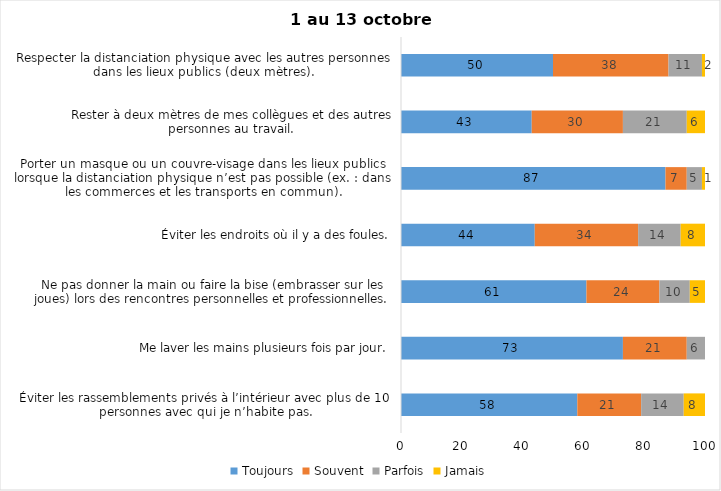
| Category | Toujours | Souvent | Parfois | Jamais |
|---|---|---|---|---|
| Éviter les rassemblements privés à l’intérieur avec plus de 10 personnes avec qui je n’habite pas. | 58 | 21 | 14 | 8 |
| Me laver les mains plusieurs fois par jour. | 73 | 21 | 6 | 0 |
| Ne pas donner la main ou faire la bise (embrasser sur les joues) lors des rencontres personnelles et professionnelles. | 61 | 24 | 10 | 5 |
| Éviter les endroits où il y a des foules. | 44 | 34 | 14 | 8 |
| Porter un masque ou un couvre-visage dans les lieux publics lorsque la distanciation physique n’est pas possible (ex. : dans les commerces et les transports en commun). | 87 | 7 | 5 | 1 |
| Rester à deux mètres de mes collègues et des autres personnes au travail. | 43 | 30 | 21 | 6 |
| Respecter la distanciation physique avec les autres personnes dans les lieux publics (deux mètres). | 50 | 38 | 11 | 2 |